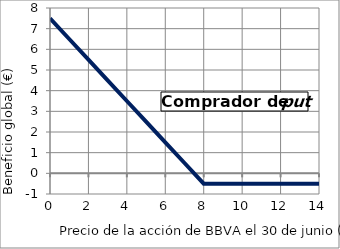
| Category | Comprador |
|---|---|
| 0.0 | 7.5 |
| 1.0 | 6.5 |
| 2.0 | 5.5 |
| 3.0 | 4.5 |
| 4.0 | 3.5 |
| 5.0 | 2.5 |
| 6.0 | 1.5 |
| 7.0 | 0.5 |
| 8.0 | -0.5 |
| 9.0 | -0.5 |
| 10.0 | -0.5 |
| 11.0 | -0.5 |
| 12.0 | -0.5 |
| 13.0 | -0.5 |
| 14.0 | -0.5 |